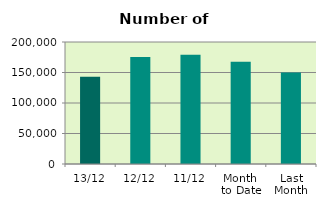
| Category | Series 0 |
|---|---|
| 13/12 | 143200 |
| 12/12 | 175452 |
| 11/12 | 178996 |
| Month 
to Date | 167722 |
| Last
Month | 150008.364 |